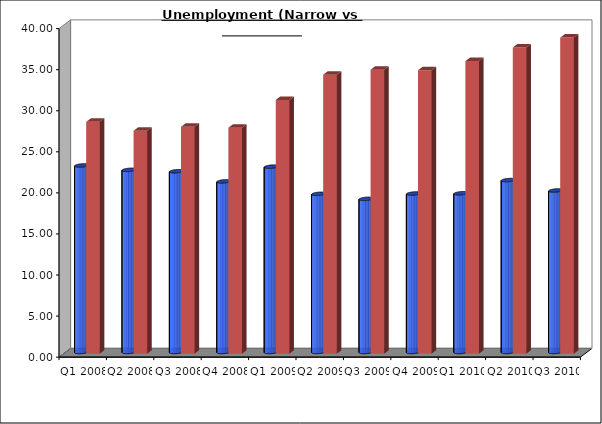
| Category | Unemployment rate | Unemployment Rate (Expanded Def) |
|---|---|---|
| Q1 2008 | 22.715 | 28.235 |
| Q2 2008 | 22.179 | 27.151 |
| Q3 2008 | 22.011 | 27.627 |
| Q4 2008 | 20.777 | 27.522 |
| Q1 2009 | 22.568 | 30.911 |
| Q2 2009 | 19.257 | 33.98 |
| Q3 2009 | 18.647 | 34.589 |
| Q4 2009 | 19.296 | 34.518 |
| Q1 2010 | 19.326 | 35.636 |
| Q2 2010 | 20.935 | 37.293 |
| Q3 2010 | 19.666 | 38.495 |